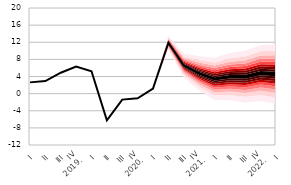
| Category | Series 0 |
|---|---|
| I | 2.628 |
| II | 2.938 |
| III | 4.886 |
| IV
2019. | 6.309 |
| I | 5.212 |
| II | -6.245 |
| III | -1.399 |
| IV
2020. | -1.074 |
| I | 1.194 |
| II | 11.892 |
| III | 6.576 |
| IV
2021. | 4.728 |
| I | 3.442 |
| II | 3.955 |
| III | 3.955 |
| IV
2022. | 4.783 |
| I | 4.576 |